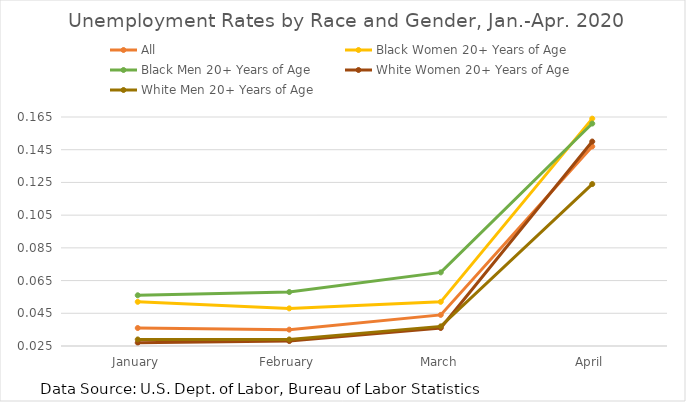
| Category | All | Black Women 20+ Years of Age | Black Men 20+ Years of Age | White Women 20+ Years of Age | White Men 20+ Years of Age |
|---|---|---|---|---|---|
| January | 0.036 | 0.052 | 0.056 | 0.027 | 0.029 |
| February | 0.035 | 0.048 | 0.058 | 0.028 | 0.029 |
| March | 0.044 | 0.052 | 0.07 | 0.036 | 0.037 |
| April | 0.147 | 0.164 | 0.161 | 0.15 | 0.124 |